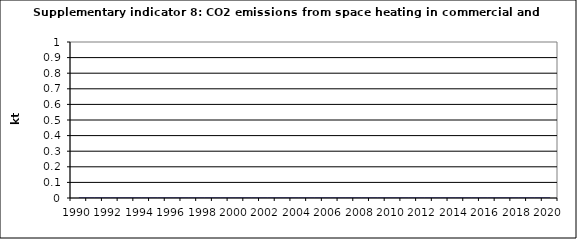
| Category | CO2 emissions from space heating in commercial and institutional, kt |
|---|---|
| 1990 | 0 |
| 1991 | 0 |
| 1992 | 0 |
| 1993 | 0 |
| 1994 | 0 |
| 1995 | 0 |
| 1996 | 0 |
| 1997 | 0 |
| 1998 | 0 |
| 1999 | 0 |
| 2000 | 0 |
| 2001 | 0 |
| 2002 | 0 |
| 2003 | 0 |
| 2004 | 0 |
| 2005 | 0 |
| 2006 | 0 |
| 2007 | 0 |
| 2008 | 0 |
| 2009 | 0 |
| 2010 | 0 |
| 2011 | 0 |
| 2012 | 0 |
| 2013 | 0 |
| 2014 | 0 |
| 2015 | 0 |
| 2016 | 0 |
| 2017 | 0 |
| 2018 | 0 |
| 2019 | 0 |
| 2020 | 0 |